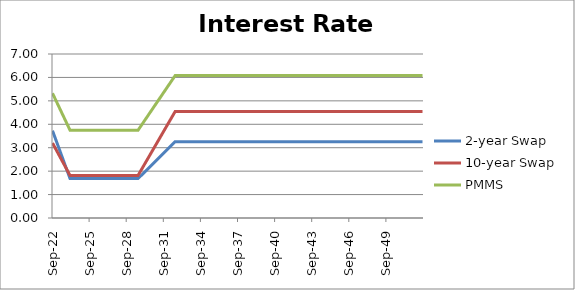
| Category | 2-year Swap | 10-year Swap | PMMS |
|---|---|---|---|
| 2022-09-30 | 3.728 | 3.199 | 5.323 |
| 2022-10-31 | 3.607 | 3.118 | 5.231 |
| 2022-11-30 | 3.487 | 3.036 | 5.138 |
| 2022-12-31 | 3.367 | 2.955 | 5.045 |
| 2023-01-31 | 3.247 | 2.874 | 4.952 |
| 2023-02-28 | 3.126 | 2.792 | 4.86 |
| 2023-03-31 | 3.006 | 2.711 | 4.767 |
| 2023-04-30 | 2.886 | 2.63 | 4.674 |
| 2023-05-31 | 2.765 | 2.548 | 4.582 |
| 2023-06-30 | 2.645 | 2.467 | 4.489 |
| 2023-07-31 | 2.525 | 2.386 | 4.396 |
| 2023-08-31 | 2.405 | 2.304 | 4.304 |
| 2023-09-30 | 2.284 | 2.223 | 4.211 |
| 2023-10-31 | 2.164 | 2.142 | 4.118 |
| 2023-11-30 | 2.044 | 2.06 | 4.025 |
| 2023-12-31 | 1.924 | 1.979 | 3.933 |
| 2024-01-31 | 1.803 | 1.898 | 3.84 |
| 2024-02-29 | 1.683 | 1.816 | 3.747 |
| 2024-03-31 | 1.683 | 1.816 | 3.747 |
| 2024-04-30 | 1.683 | 1.816 | 3.747 |
| 2024-05-31 | 1.683 | 1.816 | 3.747 |
| 2024-06-30 | 1.683 | 1.816 | 3.747 |
| 2024-07-31 | 1.683 | 1.816 | 3.747 |
| 2024-08-31 | 1.683 | 1.816 | 3.747 |
| 2024-09-30 | 1.683 | 1.816 | 3.747 |
| 2024-10-31 | 1.683 | 1.816 | 3.747 |
| 2024-11-30 | 1.683 | 1.816 | 3.747 |
| 2024-12-31 | 1.683 | 1.816 | 3.747 |
| 2025-01-31 | 1.683 | 1.816 | 3.747 |
| 2025-02-28 | 1.683 | 1.816 | 3.747 |
| 2025-03-31 | 1.683 | 1.816 | 3.747 |
| 2025-04-30 | 1.683 | 1.816 | 3.747 |
| 2025-05-31 | 1.683 | 1.816 | 3.747 |
| 2025-06-30 | 1.683 | 1.816 | 3.747 |
| 2025-07-31 | 1.683 | 1.816 | 3.747 |
| 2025-08-31 | 1.683 | 1.816 | 3.747 |
| 2025-09-30 | 1.683 | 1.816 | 3.747 |
| 2025-10-31 | 1.683 | 1.816 | 3.747 |
| 2025-11-30 | 1.683 | 1.816 | 3.747 |
| 2025-12-31 | 1.683 | 1.816 | 3.747 |
| 2026-01-31 | 1.683 | 1.816 | 3.747 |
| 2026-02-28 | 1.683 | 1.816 | 3.747 |
| 2026-03-31 | 1.683 | 1.816 | 3.747 |
| 2026-04-30 | 1.683 | 1.816 | 3.747 |
| 2026-05-31 | 1.683 | 1.816 | 3.747 |
| 2026-06-30 | 1.683 | 1.816 | 3.747 |
| 2026-07-31 | 1.683 | 1.816 | 3.747 |
| 2026-08-31 | 1.683 | 1.816 | 3.747 |
| 2026-09-30 | 1.683 | 1.816 | 3.747 |
| 2026-10-31 | 1.683 | 1.816 | 3.747 |
| 2026-11-30 | 1.683 | 1.816 | 3.747 |
| 2026-12-31 | 1.683 | 1.816 | 3.747 |
| 2027-01-31 | 1.683 | 1.816 | 3.747 |
| 2027-02-28 | 1.683 | 1.816 | 3.747 |
| 2027-03-31 | 1.683 | 1.816 | 3.747 |
| 2027-04-30 | 1.683 | 1.816 | 3.747 |
| 2027-05-31 | 1.683 | 1.816 | 3.747 |
| 2027-06-30 | 1.683 | 1.816 | 3.747 |
| 2027-07-31 | 1.683 | 1.816 | 3.747 |
| 2027-08-31 | 1.683 | 1.816 | 3.747 |
| 2027-09-30 | 1.683 | 1.816 | 3.747 |
| 2027-10-31 | 1.683 | 1.816 | 3.747 |
| 2027-11-30 | 1.683 | 1.816 | 3.747 |
| 2027-12-31 | 1.683 | 1.816 | 3.747 |
| 2028-01-31 | 1.683 | 1.816 | 3.747 |
| 2028-02-29 | 1.683 | 1.816 | 3.747 |
| 2028-03-31 | 1.683 | 1.816 | 3.747 |
| 2028-04-30 | 1.683 | 1.816 | 3.747 |
| 2028-05-31 | 1.683 | 1.816 | 3.747 |
| 2028-06-30 | 1.683 | 1.816 | 3.747 |
| 2028-07-31 | 1.683 | 1.816 | 3.747 |
| 2028-08-31 | 1.683 | 1.816 | 3.747 |
| 2028-09-30 | 1.683 | 1.816 | 3.747 |
| 2028-10-31 | 1.683 | 1.816 | 3.747 |
| 2028-11-30 | 1.683 | 1.816 | 3.747 |
| 2028-12-31 | 1.683 | 1.816 | 3.747 |
| 2029-01-31 | 1.683 | 1.816 | 3.747 |
| 2029-02-28 | 1.683 | 1.816 | 3.747 |
| 2029-03-31 | 1.683 | 1.816 | 3.747 |
| 2029-04-30 | 1.683 | 1.816 | 3.747 |
| 2029-05-31 | 1.683 | 1.816 | 3.747 |
| 2029-06-30 | 1.683 | 1.816 | 3.747 |
| 2029-07-31 | 1.683 | 1.816 | 3.747 |
| 2029-08-31 | 1.683 | 1.816 | 3.747 |
| 2029-09-30 | 1.727 | 1.892 | 3.812 |
| 2029-10-31 | 1.771 | 1.968 | 3.877 |
| 2029-11-30 | 1.814 | 2.044 | 3.942 |
| 2029-12-31 | 1.858 | 2.12 | 4.006 |
| 2030-01-31 | 1.902 | 2.196 | 4.071 |
| 2030-02-28 | 1.946 | 2.271 | 4.136 |
| 2030-03-31 | 1.99 | 2.347 | 4.201 |
| 2030-04-30 | 2.033 | 2.423 | 4.265 |
| 2030-05-31 | 2.077 | 2.499 | 4.33 |
| 2030-06-30 | 2.121 | 2.575 | 4.395 |
| 2030-07-31 | 2.165 | 2.65 | 4.46 |
| 2030-08-31 | 2.208 | 2.726 | 4.525 |
| 2030-09-30 | 2.252 | 2.802 | 4.589 |
| 2030-10-31 | 2.296 | 2.878 | 4.654 |
| 2030-11-30 | 2.34 | 2.954 | 4.719 |
| 2030-12-31 | 2.384 | 3.03 | 4.784 |
| 2031-01-31 | 2.427 | 3.105 | 4.848 |
| 2031-02-28 | 2.471 | 3.181 | 4.913 |
| 2031-03-31 | 2.515 | 3.257 | 4.978 |
| 2031-04-30 | 2.559 | 3.333 | 5.043 |
| 2031-05-31 | 2.603 | 3.409 | 5.107 |
| 2031-06-30 | 2.646 | 3.484 | 5.172 |
| 2031-07-31 | 2.69 | 3.56 | 5.237 |
| 2031-08-31 | 2.734 | 3.636 | 5.302 |
| 2031-09-30 | 2.778 | 3.712 | 5.367 |
| 2031-10-31 | 2.821 | 3.788 | 5.431 |
| 2031-11-30 | 2.865 | 3.864 | 5.496 |
| 2031-12-31 | 2.909 | 3.939 | 5.561 |
| 2032-01-31 | 2.953 | 4.015 | 5.626 |
| 2032-02-29 | 2.997 | 4.091 | 5.69 |
| 2032-03-31 | 3.04 | 4.167 | 5.755 |
| 2032-04-30 | 3.084 | 4.243 | 5.82 |
| 2032-05-31 | 3.128 | 4.319 | 5.885 |
| 2032-06-30 | 3.172 | 4.394 | 5.949 |
| 2032-07-31 | 3.216 | 4.47 | 6.014 |
| 2032-08-31 | 3.259 | 4.546 | 6.079 |
| 2032-09-30 | 3.259 | 4.546 | 6.079 |
| 2032-10-31 | 3.259 | 4.546 | 6.079 |
| 2032-11-30 | 3.259 | 4.546 | 6.079 |
| 2032-12-31 | 3.259 | 4.546 | 6.079 |
| 2033-01-31 | 3.259 | 4.546 | 6.079 |
| 2033-02-28 | 3.259 | 4.546 | 6.079 |
| 2033-03-31 | 3.259 | 4.546 | 6.079 |
| 2033-04-30 | 3.259 | 4.546 | 6.079 |
| 2033-05-31 | 3.259 | 4.546 | 6.079 |
| 2033-06-30 | 3.259 | 4.546 | 6.079 |
| 2033-07-31 | 3.259 | 4.546 | 6.079 |
| 2033-08-31 | 3.259 | 4.546 | 6.079 |
| 2033-09-30 | 3.259 | 4.546 | 6.079 |
| 2033-10-31 | 3.259 | 4.546 | 6.079 |
| 2033-11-30 | 3.259 | 4.546 | 6.079 |
| 2033-12-31 | 3.259 | 4.546 | 6.079 |
| 2034-01-31 | 3.259 | 4.546 | 6.079 |
| 2034-02-28 | 3.259 | 4.546 | 6.079 |
| 2034-03-31 | 3.259 | 4.546 | 6.079 |
| 2034-04-30 | 3.259 | 4.546 | 6.079 |
| 2034-05-31 | 3.259 | 4.546 | 6.079 |
| 2034-06-30 | 3.259 | 4.546 | 6.079 |
| 2034-07-31 | 3.259 | 4.546 | 6.079 |
| 2034-08-31 | 3.259 | 4.546 | 6.079 |
| 2034-09-30 | 3.259 | 4.546 | 6.079 |
| 2034-10-31 | 3.259 | 4.546 | 6.079 |
| 2034-11-30 | 3.259 | 4.546 | 6.079 |
| 2034-12-31 | 3.259 | 4.546 | 6.079 |
| 2035-01-31 | 3.259 | 4.546 | 6.079 |
| 2035-02-28 | 3.259 | 4.546 | 6.079 |
| 2035-03-31 | 3.259 | 4.546 | 6.079 |
| 2035-04-30 | 3.259 | 4.546 | 6.079 |
| 2035-05-31 | 3.259 | 4.546 | 6.079 |
| 2035-06-30 | 3.259 | 4.546 | 6.079 |
| 2035-07-31 | 3.259 | 4.546 | 6.079 |
| 2035-08-31 | 3.259 | 4.546 | 6.079 |
| 2035-09-30 | 3.259 | 4.546 | 6.079 |
| 2035-10-31 | 3.259 | 4.546 | 6.079 |
| 2035-11-30 | 3.259 | 4.546 | 6.079 |
| 2035-12-31 | 3.259 | 4.546 | 6.079 |
| 2036-01-31 | 3.259 | 4.546 | 6.079 |
| 2036-02-29 | 3.259 | 4.546 | 6.079 |
| 2036-03-31 | 3.259 | 4.546 | 6.079 |
| 2036-04-30 | 3.259 | 4.546 | 6.079 |
| 2036-05-31 | 3.259 | 4.546 | 6.079 |
| 2036-06-30 | 3.259 | 4.546 | 6.079 |
| 2036-07-31 | 3.259 | 4.546 | 6.079 |
| 2036-08-31 | 3.259 | 4.546 | 6.079 |
| 2036-09-30 | 3.259 | 4.546 | 6.079 |
| 2036-10-31 | 3.259 | 4.546 | 6.079 |
| 2036-11-30 | 3.259 | 4.546 | 6.079 |
| 2036-12-31 | 3.259 | 4.546 | 6.079 |
| 2037-01-31 | 3.259 | 4.546 | 6.079 |
| 2037-02-28 | 3.259 | 4.546 | 6.079 |
| 2037-03-31 | 3.259 | 4.546 | 6.079 |
| 2037-04-30 | 3.259 | 4.546 | 6.079 |
| 2037-05-31 | 3.259 | 4.546 | 6.079 |
| 2037-06-30 | 3.259 | 4.546 | 6.079 |
| 2037-07-31 | 3.259 | 4.546 | 6.079 |
| 2037-08-31 | 3.259 | 4.546 | 6.079 |
| 2037-09-30 | 3.259 | 4.546 | 6.079 |
| 2037-10-31 | 3.259 | 4.546 | 6.079 |
| 2037-11-30 | 3.259 | 4.546 | 6.079 |
| 2037-12-31 | 3.259 | 4.546 | 6.079 |
| 2038-01-31 | 3.259 | 4.546 | 6.079 |
| 2038-02-28 | 3.259 | 4.546 | 6.079 |
| 2038-03-31 | 3.259 | 4.546 | 6.079 |
| 2038-04-30 | 3.259 | 4.546 | 6.079 |
| 2038-05-31 | 3.259 | 4.546 | 6.079 |
| 2038-06-30 | 3.259 | 4.546 | 6.079 |
| 2038-07-31 | 3.259 | 4.546 | 6.079 |
| 2038-08-31 | 3.259 | 4.546 | 6.079 |
| 2038-09-30 | 3.259 | 4.546 | 6.079 |
| 2038-10-31 | 3.259 | 4.546 | 6.079 |
| 2038-11-30 | 3.259 | 4.546 | 6.079 |
| 2038-12-31 | 3.259 | 4.546 | 6.079 |
| 2039-01-31 | 3.259 | 4.546 | 6.079 |
| 2039-02-28 | 3.259 | 4.546 | 6.079 |
| 2039-03-31 | 3.259 | 4.546 | 6.079 |
| 2039-04-30 | 3.259 | 4.546 | 6.079 |
| 2039-05-31 | 3.259 | 4.546 | 6.079 |
| 2039-06-30 | 3.259 | 4.546 | 6.079 |
| 2039-07-31 | 3.259 | 4.546 | 6.079 |
| 2039-08-31 | 3.259 | 4.546 | 6.079 |
| 2039-09-30 | 3.259 | 4.546 | 6.079 |
| 2039-10-31 | 3.259 | 4.546 | 6.079 |
| 2039-11-30 | 3.259 | 4.546 | 6.079 |
| 2039-12-31 | 3.259 | 4.546 | 6.079 |
| 2040-01-31 | 3.259 | 4.546 | 6.079 |
| 2040-02-29 | 3.259 | 4.546 | 6.079 |
| 2040-03-31 | 3.259 | 4.546 | 6.079 |
| 2040-04-30 | 3.259 | 4.546 | 6.079 |
| 2040-05-31 | 3.259 | 4.546 | 6.079 |
| 2040-06-30 | 3.259 | 4.546 | 6.079 |
| 2040-07-31 | 3.259 | 4.546 | 6.079 |
| 2040-08-31 | 3.259 | 4.546 | 6.079 |
| 2040-09-30 | 3.259 | 4.546 | 6.079 |
| 2040-10-31 | 3.259 | 4.546 | 6.079 |
| 2040-11-30 | 3.259 | 4.546 | 6.079 |
| 2040-12-31 | 3.259 | 4.546 | 6.079 |
| 2041-01-31 | 3.259 | 4.546 | 6.079 |
| 2041-02-28 | 3.259 | 4.546 | 6.079 |
| 2041-03-31 | 3.259 | 4.546 | 6.079 |
| 2041-04-30 | 3.259 | 4.546 | 6.079 |
| 2041-05-31 | 3.259 | 4.546 | 6.079 |
| 2041-06-30 | 3.259 | 4.546 | 6.079 |
| 2041-07-31 | 3.259 | 4.546 | 6.079 |
| 2041-08-31 | 3.259 | 4.546 | 6.079 |
| 2041-09-30 | 3.259 | 4.546 | 6.079 |
| 2041-10-31 | 3.259 | 4.546 | 6.079 |
| 2041-11-30 | 3.259 | 4.546 | 6.079 |
| 2041-12-31 | 3.259 | 4.546 | 6.079 |
| 2042-01-31 | 3.259 | 4.546 | 6.079 |
| 2042-02-28 | 3.259 | 4.546 | 6.079 |
| 2042-03-31 | 3.259 | 4.546 | 6.079 |
| 2042-04-30 | 3.259 | 4.546 | 6.079 |
| 2042-05-31 | 3.259 | 4.546 | 6.079 |
| 2042-06-30 | 3.259 | 4.546 | 6.079 |
| 2042-07-31 | 3.259 | 4.546 | 6.079 |
| 2042-08-31 | 3.259 | 4.546 | 6.079 |
| 2042-09-30 | 3.259 | 4.546 | 6.079 |
| 2042-10-31 | 3.259 | 4.546 | 6.079 |
| 2042-11-30 | 3.259 | 4.546 | 6.079 |
| 2042-12-31 | 3.259 | 4.546 | 6.079 |
| 2043-01-31 | 3.259 | 4.546 | 6.079 |
| 2043-02-28 | 3.259 | 4.546 | 6.079 |
| 2043-03-31 | 3.259 | 4.546 | 6.079 |
| 2043-04-30 | 3.259 | 4.546 | 6.079 |
| 2043-05-31 | 3.259 | 4.546 | 6.079 |
| 2043-06-30 | 3.259 | 4.546 | 6.079 |
| 2043-07-31 | 3.259 | 4.546 | 6.079 |
| 2043-08-31 | 3.259 | 4.546 | 6.079 |
| 2043-09-30 | 3.259 | 4.546 | 6.079 |
| 2043-10-31 | 3.259 | 4.546 | 6.079 |
| 2043-11-30 | 3.259 | 4.546 | 6.079 |
| 2043-12-31 | 3.259 | 4.546 | 6.079 |
| 2044-01-31 | 3.259 | 4.546 | 6.079 |
| 2044-02-29 | 3.259 | 4.546 | 6.079 |
| 2044-03-31 | 3.259 | 4.546 | 6.079 |
| 2044-04-30 | 3.259 | 4.546 | 6.079 |
| 2044-05-31 | 3.259 | 4.546 | 6.079 |
| 2044-06-30 | 3.259 | 4.546 | 6.079 |
| 2044-07-31 | 3.259 | 4.546 | 6.079 |
| 2044-08-31 | 3.259 | 4.546 | 6.079 |
| 2044-09-30 | 3.259 | 4.546 | 6.079 |
| 2044-10-31 | 3.259 | 4.546 | 6.079 |
| 2044-11-30 | 3.259 | 4.546 | 6.079 |
| 2044-12-31 | 3.259 | 4.546 | 6.079 |
| 2045-01-31 | 3.259 | 4.546 | 6.079 |
| 2045-02-28 | 3.259 | 4.546 | 6.079 |
| 2045-03-31 | 3.259 | 4.546 | 6.079 |
| 2045-04-30 | 3.259 | 4.546 | 6.079 |
| 2045-05-31 | 3.259 | 4.546 | 6.079 |
| 2045-06-30 | 3.259 | 4.546 | 6.079 |
| 2045-07-31 | 3.259 | 4.546 | 6.079 |
| 2045-08-31 | 3.259 | 4.546 | 6.079 |
| 2045-09-30 | 3.259 | 4.546 | 6.079 |
| 2045-10-31 | 3.259 | 4.546 | 6.079 |
| 2045-11-30 | 3.259 | 4.546 | 6.079 |
| 2045-12-31 | 3.259 | 4.546 | 6.079 |
| 2046-01-31 | 3.259 | 4.546 | 6.079 |
| 2046-02-28 | 3.259 | 4.546 | 6.079 |
| 2046-03-31 | 3.259 | 4.546 | 6.079 |
| 2046-04-30 | 3.259 | 4.546 | 6.079 |
| 2046-05-31 | 3.259 | 4.546 | 6.079 |
| 2046-06-30 | 3.259 | 4.546 | 6.079 |
| 2046-07-31 | 3.259 | 4.546 | 6.079 |
| 2046-08-31 | 3.259 | 4.546 | 6.079 |
| 2046-09-30 | 3.259 | 4.546 | 6.079 |
| 2046-10-31 | 3.259 | 4.546 | 6.079 |
| 2046-11-30 | 3.259 | 4.546 | 6.079 |
| 2046-12-31 | 3.259 | 4.546 | 6.079 |
| 2047-01-31 | 3.259 | 4.546 | 6.079 |
| 2047-02-28 | 3.259 | 4.546 | 6.079 |
| 2047-03-31 | 3.259 | 4.546 | 6.079 |
| 2047-04-30 | 3.259 | 4.546 | 6.079 |
| 2047-05-31 | 3.259 | 4.546 | 6.079 |
| 2047-06-30 | 3.259 | 4.546 | 6.079 |
| 2047-07-31 | 3.259 | 4.546 | 6.079 |
| 2047-08-31 | 3.259 | 4.546 | 6.079 |
| 2047-09-30 | 3.259 | 4.546 | 6.079 |
| 2047-10-31 | 3.259 | 4.546 | 6.079 |
| 2047-11-30 | 3.259 | 4.546 | 6.079 |
| 2047-12-31 | 3.259 | 4.546 | 6.079 |
| 2048-01-31 | 3.259 | 4.546 | 6.079 |
| 2048-02-29 | 3.259 | 4.546 | 6.079 |
| 2048-03-31 | 3.259 | 4.546 | 6.079 |
| 2048-04-30 | 3.259 | 4.546 | 6.079 |
| 2048-05-31 | 3.259 | 4.546 | 6.079 |
| 2048-06-30 | 3.259 | 4.546 | 6.079 |
| 2048-07-31 | 3.259 | 4.546 | 6.079 |
| 2048-08-31 | 3.259 | 4.546 | 6.079 |
| 2048-09-30 | 3.259 | 4.546 | 6.079 |
| 2048-10-31 | 3.259 | 4.546 | 6.079 |
| 2048-11-30 | 3.259 | 4.546 | 6.079 |
| 2048-12-31 | 3.259 | 4.546 | 6.079 |
| 2049-01-31 | 3.259 | 4.546 | 6.079 |
| 2049-02-28 | 3.259 | 4.546 | 6.079 |
| 2049-03-31 | 3.259 | 4.546 | 6.079 |
| 2049-04-30 | 3.259 | 4.546 | 6.079 |
| 2049-05-31 | 3.259 | 4.546 | 6.079 |
| 2049-06-30 | 3.259 | 4.546 | 6.079 |
| 2049-07-31 | 3.259 | 4.546 | 6.079 |
| 2049-08-31 | 3.259 | 4.546 | 6.079 |
| 2049-09-30 | 3.259 | 4.546 | 6.079 |
| 2049-10-31 | 3.259 | 4.546 | 6.079 |
| 2049-11-30 | 3.259 | 4.546 | 6.079 |
| 2049-12-31 | 3.259 | 4.546 | 6.079 |
| 2050-01-31 | 3.259 | 4.546 | 6.079 |
| 2050-02-28 | 3.259 | 4.546 | 6.079 |
| 2050-03-31 | 3.259 | 4.546 | 6.079 |
| 2050-04-30 | 3.259 | 4.546 | 6.079 |
| 2050-05-31 | 3.259 | 4.546 | 6.079 |
| 2050-06-30 | 3.259 | 4.546 | 6.079 |
| 2050-07-31 | 3.259 | 4.546 | 6.079 |
| 2050-08-31 | 3.259 | 4.546 | 6.079 |
| 2050-09-30 | 3.259 | 4.546 | 6.079 |
| 2050-10-31 | 3.259 | 4.546 | 6.079 |
| 2050-11-30 | 3.259 | 4.546 | 6.079 |
| 2050-12-31 | 3.259 | 4.546 | 6.079 |
| 2051-01-31 | 3.259 | 4.546 | 6.079 |
| 2051-02-28 | 3.259 | 4.546 | 6.079 |
| 2051-03-31 | 3.259 | 4.546 | 6.079 |
| 2051-04-30 | 3.259 | 4.546 | 6.079 |
| 2051-05-31 | 3.259 | 4.546 | 6.079 |
| 2051-06-30 | 3.259 | 4.546 | 6.079 |
| 2051-07-31 | 3.259 | 4.546 | 6.079 |
| 2051-08-31 | 3.259 | 4.546 | 6.079 |
| 2051-09-30 | 3.259 | 4.546 | 6.079 |
| 2051-10-31 | 3.259 | 4.546 | 6.079 |
| 2051-11-30 | 3.259 | 4.546 | 6.079 |
| 2051-12-31 | 3.259 | 4.546 | 6.079 |
| 2052-01-31 | 3.259 | 4.546 | 6.079 |
| 2052-02-29 | 3.259 | 4.546 | 6.079 |
| 2052-03-31 | 3.259 | 4.546 | 6.079 |
| 2052-04-30 | 3.259 | 4.546 | 6.079 |
| 2052-05-31 | 3.259 | 4.546 | 6.079 |
| 2052-06-30 | 3.259 | 4.546 | 6.079 |
| 2052-07-31 | 3.259 | 4.546 | 6.079 |
| 2052-08-31 | 3.259 | 4.546 | 6.079 |